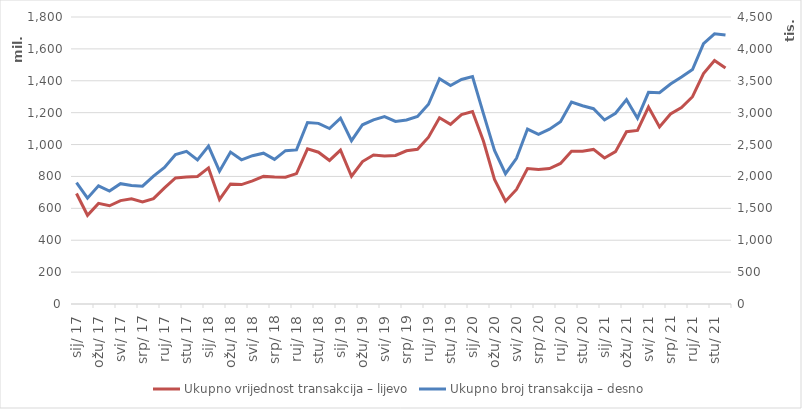
| Category | Ukupno |
|---|---|
| 2017-01-01 | 692948345 |
| 2017-02-01 | 556418837 |
| 2017-03-01 | 631091280 |
| 2017-04-01 | 615993630 |
| 2017-05-01 | 648629380 |
| 2017-06-01 | 659859183 |
| 2017-07-01 | 640128686 |
| 2017-08-01 | 660847615 |
| 2017-09-01 | 728459665 |
| 2017-10-01 | 790689068 |
| 2017-11-01 | 797055016 |
| 2017-12-01 | 799872308 |
| 2018-01-01 | 853592153 |
| 2018-02-01 | 655926827 |
| 2018-03-01 | 752870032 |
| 2018-04-01 | 748849650 |
| 2018-05-01 | 772607012 |
| 2018-06-01 | 800347667 |
| 2018-07-01 | 796226717 |
| 2018-08-01 | 795722806 |
| 2018-09-01 | 817671052 |
| 2018-10-01 | 973090121 |
| 2018-11-01 | 951940506 |
| 2018-12-01 | 900339566 |
| 2019-01-01 | 964859478.141 |
| 2019-02-01 | 801230409.391 |
| 2019-03-01 | 893619939.186 |
| 2019-04-01 | 934260221.069 |
| 2019-05-01 | 928013285.13 |
| 2019-06-01 | 931594027.121 |
| 2019-07-01 | 960824947.818 |
| 2019-08-01 | 970372664.504 |
| 2019-09-01 | 1046414153.182 |
| 2019-10-01 | 1167784591.403 |
| 2019-11-01 | 1126379975.393 |
| 2019-12-01 | 1188209702.989 |
| 2020-01-01 | 1207442251.338 |
| 2020-02-01 | 1020966852.211 |
| 2020-03-01 | 781909445.435 |
| 2020-04-01 | 644672811.643 |
| 2020-05-01 | 718170313.006 |
| 2020-06-01 | 849262284.621 |
| 2020-07-01 | 843240800.575 |
| 2020-08-01 | 849735212.73 |
| 2020-09-01 | 881347165.504 |
| 2020-10-01 | 958710552.608 |
| 2020-11-01 | 957642177.602 |
| 2020-12-01 | 969383038.753 |
| 2021-01-01 | 915488707 |
| 2021-02-01 | 955773392 |
| 2021-03-01 | 1080385303 |
| 2021-04-01 | 1088805882 |
| 2021-05-01 | 1234785070 |
| 2021-06-01 | 1110980736 |
| 2021-07-01 | 1192157079 |
| 2021-08-01 | 1232071569 |
| 2021-09-01 | 1300128867 |
| 2021-10-01 | 1445420733 |
| 2021-11-01 | 1527730076 |
| 2021-12-01 | 1479594592 |